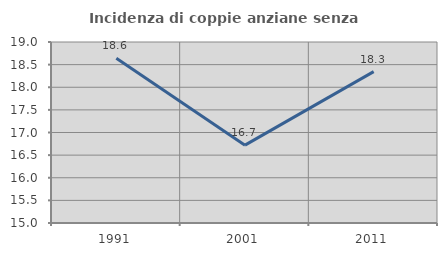
| Category | Incidenza di coppie anziane senza figli  |
|---|---|
| 1991.0 | 18.639 |
| 2001.0 | 16.72 |
| 2011.0 | 18.345 |